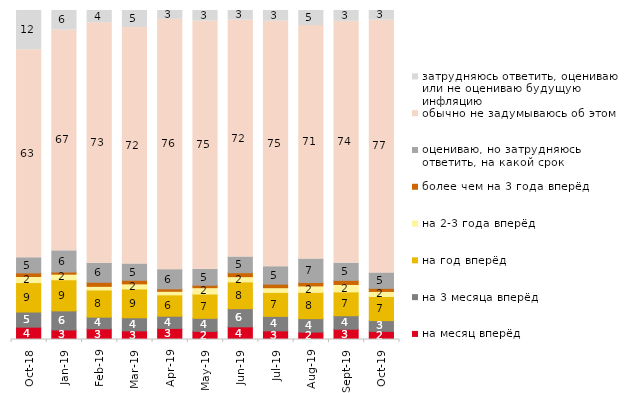
| Category | на месяц вперёд | на 3 месяца вперёд | на год вперёд | на 2-3 года вперёд | более чем на 3 года вперёд | оцениваю, но затрудняюсь ответить, на какой срок | обычно не задумываюсь об этом | затрудняюсь ответить, оцениваю или не оцениваю будущую инфляцию |
|---|---|---|---|---|---|---|---|---|
| 2018-10-01 | 3.75 | 4.6 | 8.95 | 1.85 | 1.1 | 4.6 | 63.2 | 11.95 |
| 2019-01-01 | 2.9 | 5.8 | 9.45 | 1.7 | 0.65 | 6.45 | 67.1 | 5.95 |
| 2019-02-01 | 3.25 | 3.55 | 8.25 | 1.1 | 1.25 | 5.8 | 73.05 | 3.75 |
| 2019-03-01 | 2.636 | 3.978 | 8.752 | 1.542 | 1.094 | 4.973 | 71.855 | 5.172 |
| 2019-04-01 | 3.366 | 3.713 | 6.485 | 1.089 | 0.743 | 5.842 | 76.089 | 2.673 |
| 2019-05-01 | 2.476 | 3.962 | 7.38 | 1.932 | 0.743 | 4.854 | 75.433 | 3.219 |
| 2019-06-01 | 3.84 | 5.536 | 8.13 | 1.596 | 1.197 | 4.788 | 71.97 | 2.943 |
| 2019-07-01 | 2.624 | 4.406 | 7.277 | 1.436 | 1.089 | 5.297 | 74.653 | 3.218 |
| 2019-08-01 | 2.248 | 4.096 | 7.992 | 1.948 | 1.049 | 7.143 | 70.929 | 4.595 |
| 2019-09-01 | 3.119 | 4.109 | 7.228 | 2.277 | 1.238 | 5.248 | 73.515 | 3.267 |
| 2019-10-01 | 2.475 | 3.267 | 7.327 | 1.535 | 0.941 | 4.703 | 76.832 | 2.921 |